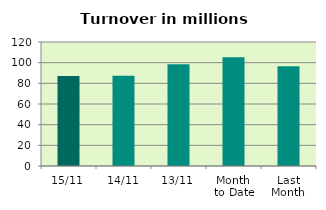
| Category | Series 0 |
|---|---|
| 15/11 | 87.091 |
| 14/11 | 87.224 |
| 13/11 | 98.407 |
| Month 
to Date | 105.231 |
| Last
Month | 96.433 |